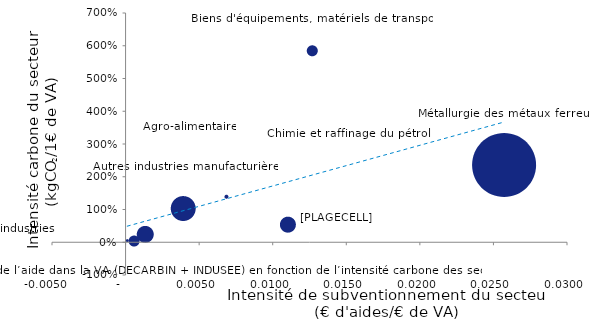
| Category | Intensité de subventionnement du secteur 
(€ d'aides/€ de VA) 

 |
|---|---|
| 0.00130327409878232 | 0.255 |
| 0.000563862998159094 | 0.043 |
| 0.000115809241155203 | 0.051 |
| 0.00388803628518301 | 1.043 |
| 0.01268872290103 | 5.846 |
| 0.0068505531569527 | 1.393 |
| 0.0257245053534657 | 2.363 |
| 0.0110287119825643 | 0.539 |